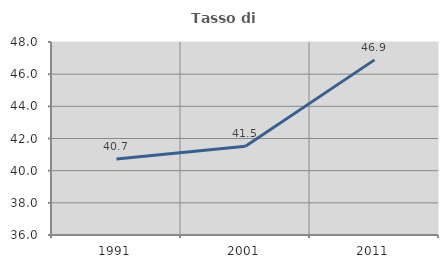
| Category | Tasso di occupazione   |
|---|---|
| 1991.0 | 40.732 |
| 2001.0 | 41.514 |
| 2011.0 | 46.888 |